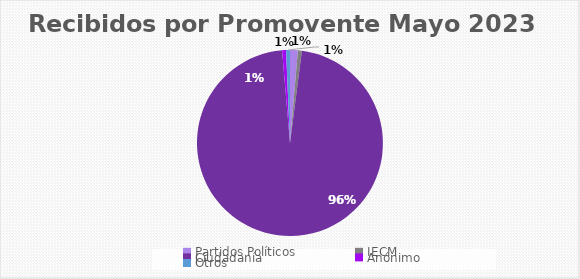
| Category | Recibidos por Promovente MAYO |
|---|---|
| Partidos Políticos | 2 |
| IECM | 1 |
| Ciudadanía  | 142 |
| Anónimo | 1 |
| Otros | 1 |